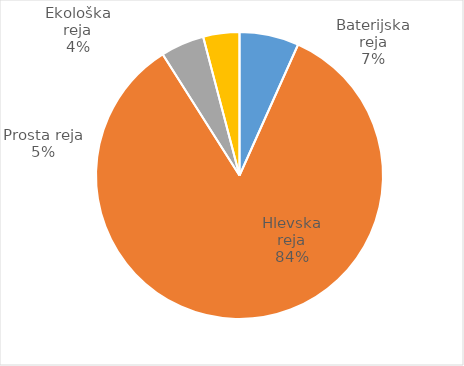
| Category | Število kosov jajc |
|---|---|
| Baterijska reja | 209959 |
| Hlevska reja | 2644352 |
| Prosta reja | 154086 |
| Ekološka reja | 127890 |